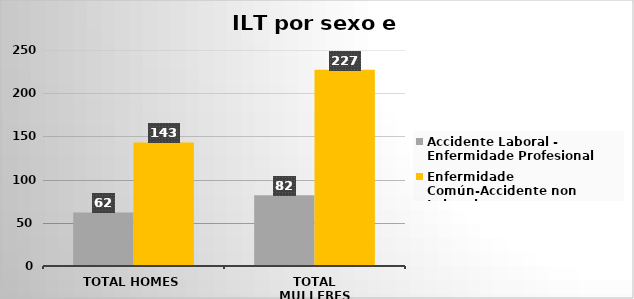
| Category | Accidente Laboral - Enfermidade Profesional | Enfermidade Común-Accidente non Laboral |
|---|---|---|
| Total Homes | 62 | 143 |
| Total Mulleres | 82 | 227 |